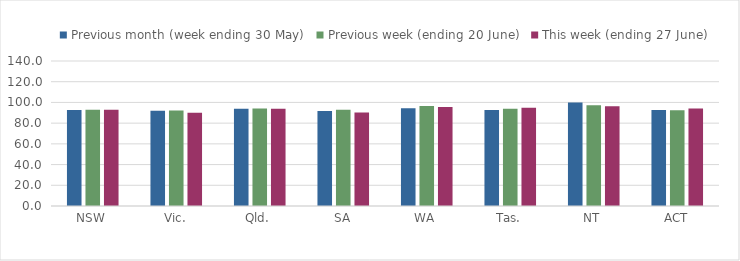
| Category | Previous month (week ending 30 May) | Previous week (ending 20 June) | This week (ending 27 June) |
|---|---|---|---|
| NSW | 92.64 | 92.968 | 92.811 |
| Vic. | 91.941 | 92.187 | 90.004 |
| Qld. | 93.862 | 94.185 | 93.89 |
| SA | 91.81 | 92.86 | 90.236 |
| WA | 94.442 | 96.672 | 95.495 |
| Tas. | 92.739 | 93.894 | 94.818 |
| NT | 100 | 97.216 | 96.321 |
| ACT | 92.63 | 92.46 | 94.078 |